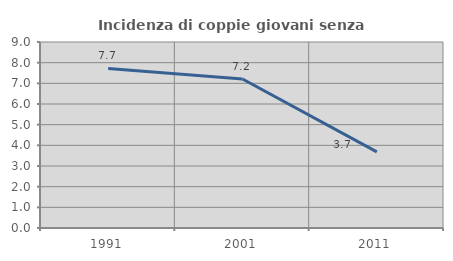
| Category | Incidenza di coppie giovani senza figli |
|---|---|
| 1991.0 | 7.72 |
| 2001.0 | 7.209 |
| 2011.0 | 3.681 |